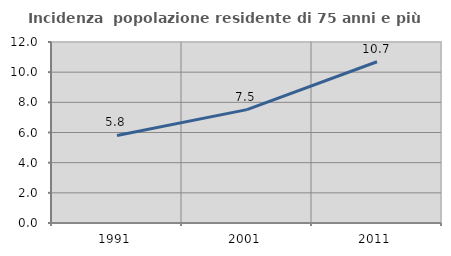
| Category | Incidenza  popolazione residente di 75 anni e più |
|---|---|
| 1991.0 | 5.806 |
| 2001.0 | 7.517 |
| 2011.0 | 10.691 |